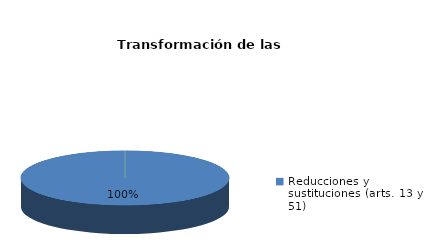
| Category | Series 0 |
|---|---|
| Reducciones y sustituciones (arts. 13 y 51) | 28 |
| Por quebrantamiento (art. 50.2) | 0 |
| Cancelaciones anticipadas | 0 |
| Traslado a Centros Penitenciarios | 0 |
| Conversión internamientos en cerrados (art. 51.2) | 0 |